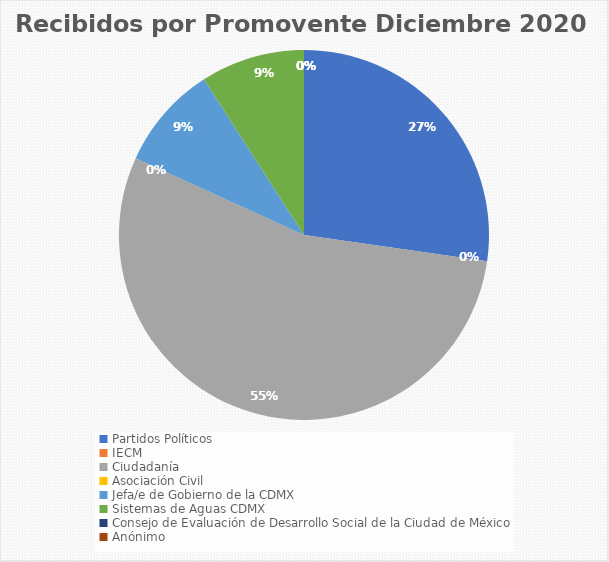
| Category | Recibidos por Promovente Diciembre |
|---|---|
| Partidos Políticos | 3 |
| IECM | 0 |
| Ciudadanía  | 6 |
| Asociación Civil | 0 |
| Jefa/e de Gobierno de la CDMX | 1 |
| Sistemas de Aguas CDMX | 1 |
| Consejo de Evaluación de Desarrollo Social de la Ciudad de México | 0 |
| Anónimo | 0 |